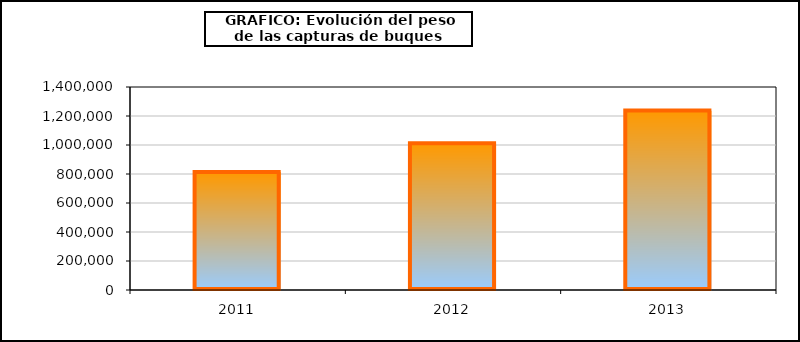
| Category | Series 0 |
|---|---|
| 0 | 813197.173 |
| 1 | 1012433.853 |
| 2 | 1237306.504 |